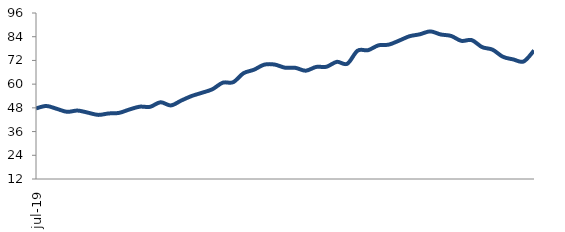
| Category | Series 0 |
|---|---|
| 2019-07-01 | 47.705 |
| 2019-08-01 | 48.94 |
| 2019-09-01 | 47.515 |
| 2019-10-01 | 45.989 |
| 2019-11-01 | 46.631 |
| 2019-12-01 | 45.576 |
| 2020-01-01 | 44.444 |
| 2020-02-01 | 45.166 |
| 2020-03-01 | 45.444 |
| 2020-04-01 | 47.162 |
| 2020-05-01 | 48.595 |
| 2020-06-01 | 48.53 |
| 2020-07-01 | 50.83 |
| 2020-08-01 | 49.231 |
| 2020-09-01 | 51.699 |
| 2020-10-01 | 53.991 |
| 2020-11-01 | 55.639 |
| 2020-12-01 | 57.413 |
| 2021-01-01 | 60.742 |
| 2021-02-01 | 60.984 |
| 2021-03-01 | 65.524 |
| 2021-04-01 | 67.28 |
| 2021-05-01 | 69.863 |
| 2021-06-01 | 69.912 |
| 2021-07-01 | 68.331 |
| 2021-08-01 | 68.248 |
| 2021-09-01 | 66.807 |
| 2021-10-01 | 68.707 |
| 2021-11-01 | 68.802 |
| 2021-12-01 | 71.282 |
| 2022-01-01 | 70.309 |
| 2022-02-01 | 76.939 |
| 2022-03-01 | 77.168 |
| 2022-04-01 | 79.628 |
| 2022-05-01 | 79.996 |
| 2022-06-01 | 82.029 |
| 2022-07-01 | 84.239 |
| 2022-08-01 | 85.232 |
| 2022-09-01 | 86.701 |
| 2022-10-01 | 85.146 |
| 2022-11-01 | 84.409 |
| 2022-12-01 | 81.907 |
| 2023-01-01 | 82.272 |
| 2023-02-01 | 78.738 |
| 2023-03-01 | 77.447 |
| 2023-04-01 | 73.856 |
| 2023-05-01 | 72.507 |
| 2023-06-01 | 71.462 |
| 2023-07-01 | 77.031 |